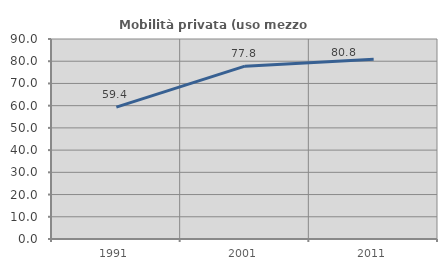
| Category | Mobilità privata (uso mezzo privato) |
|---|---|
| 1991.0 | 59.358 |
| 2001.0 | 77.778 |
| 2011.0 | 80.833 |